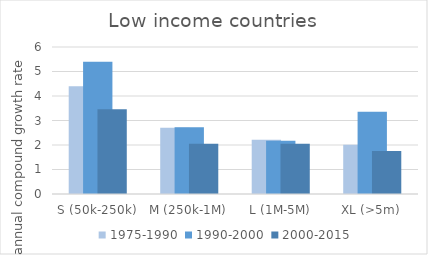
| Category | 1975-1990 | 1990-2000 | 2000-2015 |
|---|---|---|---|
| S (50k-250k) | 4.399 | 5.4 | 3.46 |
| M (250k-1M) | 2.707 | 2.724 | 2.046 |
| L (1M-5M) | 2.217 | 2.172 | 2.046 |
| XL (>5m) | 2.011 | 3.36 | 1.759 |